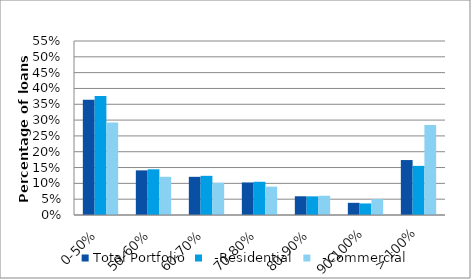
| Category | Total Portfolio |   -Residential |   -Commercial |
|---|---|---|---|
| 0-50% | 0.364 | 0.376 | 0.292 |
| 50-60% | 0.141 | 0.144 | 0.121 |
| 60-70% | 0.121 | 0.124 | 0.102 |
| 70-80% | 0.103 | 0.105 | 0.09 |
| 80-90% | 0.059 | 0.059 | 0.061 |
| 90-100% | 0.038 | 0.036 | 0.05 |
| > 100% | 0.174 | 0.155 | 0.284 |